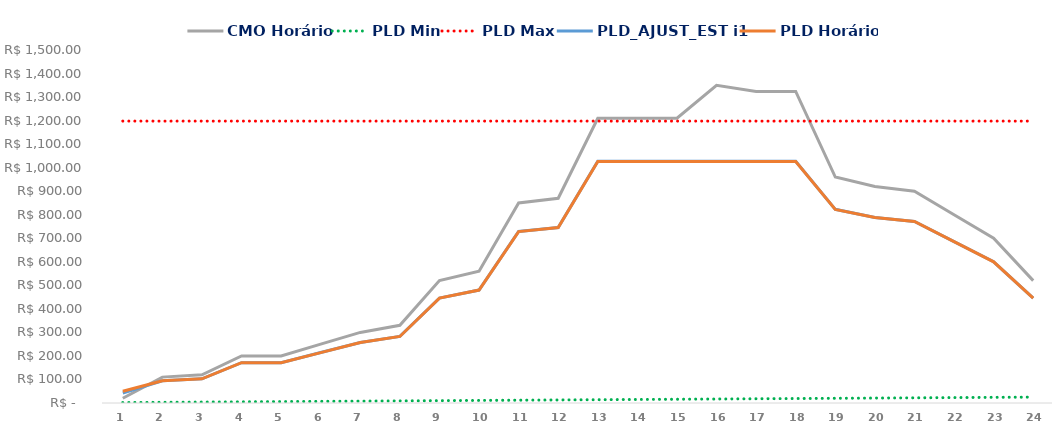
| Category | CMO Horário | PLD Min | PLD Max | PLD_AJUST_EST i1 | PLD Horário |
|---|---|---|---|---|---|
| 0 | 20 | 2 | 1197.87 | 42.66 | 49.77 |
| 1 | 110 | 3 | 1197.87 | 94.296 | 94.252 |
| 2 | 120 | 4 | 1197.87 | 102.868 | 102.817 |
| 3 | 200 | 5 | 1197.87 | 171.447 | 171.362 |
| 4 | 200 | 6 | 1197.87 | 171.447 | 171.362 |
| 5 | 250 | 7 | 1197.87 | 214.309 | 214.2 |
| 6 | 300 | 8 | 1197.87 | 257.171 | 257.038 |
| 7 | 330 | 9 | 1197.87 | 282.888 | 282.745 |
| 8 | 520 | 10 | 1197.87 | 445.762 | 445.531 |
| 9 | 560 | 11 | 1197.87 | 480.052 | 479.803 |
| 10 | 850 | 12 | 1197.87 | 728.65 | 728.276 |
| 11 | 870 | 13 | 1197.87 | 745.795 | 745.407 |
| 12 | 1210 | 14 | 1197.87 | 1026.856 | 1026.333 |
| 13 | 1210 | 15 | 1197.87 | 1026.856 | 1026.333 |
| 14 | 1210 | 16 | 1197.87 | 1026.856 | 1026.333 |
| 15 | 1350 | 17 | 1197.87 | 1026.856 | 1026.333 |
| 16 | 1324.18 | 18 | 1197.87 | 1026.856 | 1026.333 |
| 17 | 1324.18 | 19 | 1197.87 | 1026.856 | 1026.333 |
| 18 | 960 | 20 | 1197.87 | 822.946 | 822.527 |
| 19 | 920 | 21 | 1197.87 | 788.656 | 788.255 |
| 20 | 900 | 22 | 1197.87 | 771.512 | 771.114 |
| 21 | 800 | 23 | 1197.87 | 685.788 | 685.438 |
| 22 | 700 | 24 | 1197.87 | 600.065 | 599.752 |
| 23 | 520 | 25 | 1197.87 | 445.762 | 445.531 |